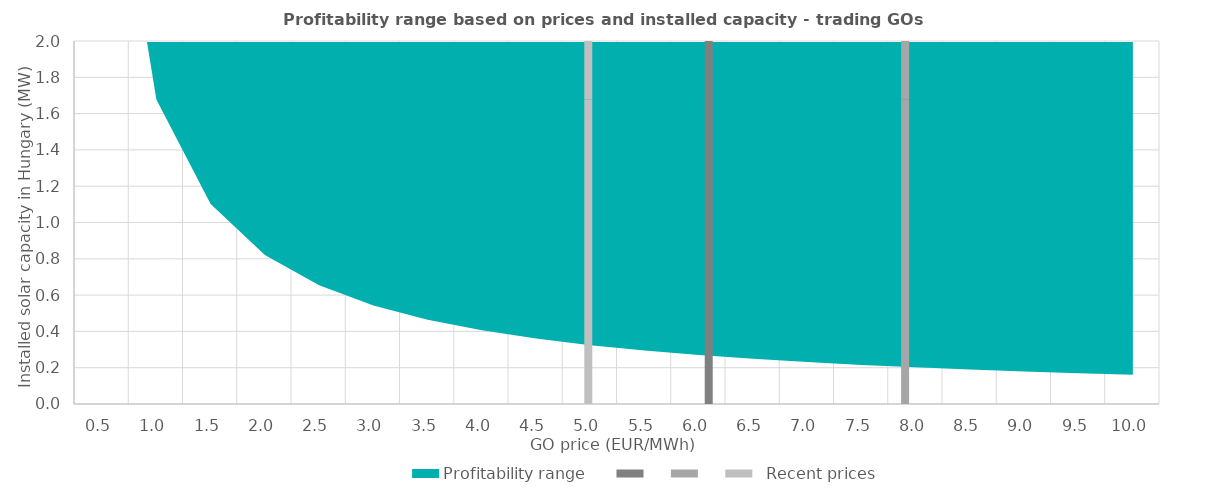
| Category | Series 0 | Profitability range |
|---|---|---|
| 0.5 | 3.511 | 4.511 |
| 1.0 | 1.678 | 4.511 |
| 1.5 | 1.102 | 4.511 |
| 2.0 | 0.821 | 4.511 |
| 2.5 | 0.654 | 4.511 |
| 3.0 | 0.543 | 4.511 |
| 3.5 | 0.465 | 4.511 |
| 4.0 | 0.406 | 4.511 |
| 4.5 | 0.36 | 4.511 |
| 5.0 | 0.324 | 4.511 |
| 5.5 | 0.294 | 4.511 |
| 6.0 | 0.27 | 4.511 |
| 6.5 | 0.249 | 4.511 |
| 7.0 | 0.231 | 4.511 |
| 7.5 | 0.215 | 4.511 |
| 8.0 | 0.202 | 4.511 |
| 8.5 | 0.19 | 4.511 |
| 9.0 | 0.179 | 4.511 |
| 9.5 | 0.17 | 4.511 |
| 10.0 | 0.161 | 4.511 |